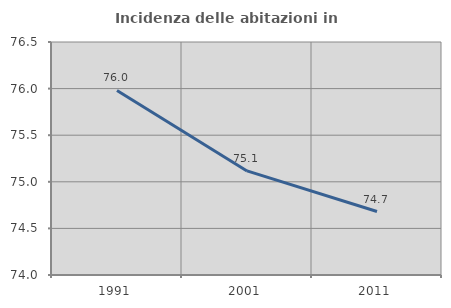
| Category | Incidenza delle abitazioni in proprietà  |
|---|---|
| 1991.0 | 75.98 |
| 2001.0 | 75.117 |
| 2011.0 | 74.681 |